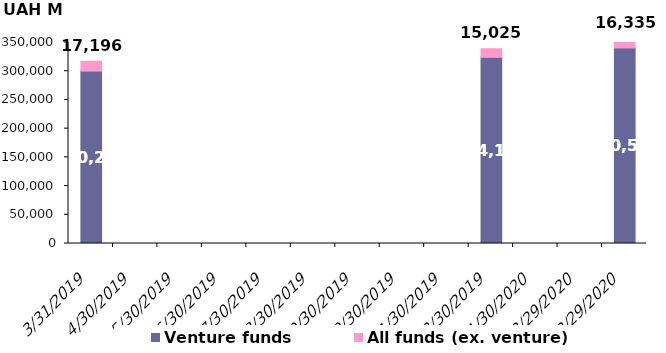
| Category | Venture funds | All funds (ex. venture) |
|---|---|---|
| 3/31/19 | 300241.731 | 17195.754 |
| 12/31/19 | 324105.005 | 15024.795 |
| 3/31/20 | 340549.472 | 16334.801 |